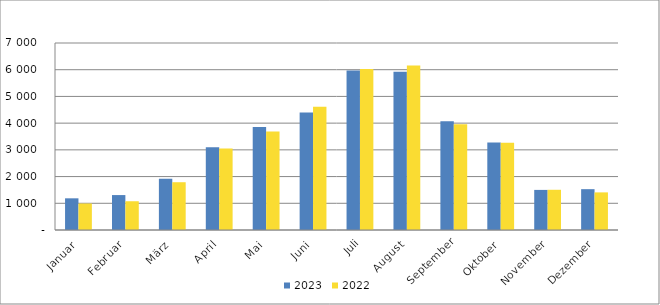
| Category | 2023 | 2022 |
|---|---|---|
| Januar | 1185824 | 992481 |
| Februar | 1307497 | 1076602 |
| März | 1918770 | 1788424 |
| April | 3094598 | 3046727 |
| Mai | 3857028 | 3686767 |
| Juni | 4398925 | 4613406 |
| Juli | 5969151 | 6027469 |
| August | 5921973 | 6153206 |
| September | 4072766 | 3962128 |
| Oktober | 3278175 | 3269839 |
| November | 1500725 | 1505721 |
| Dezember | 1528502 | 1408039 |